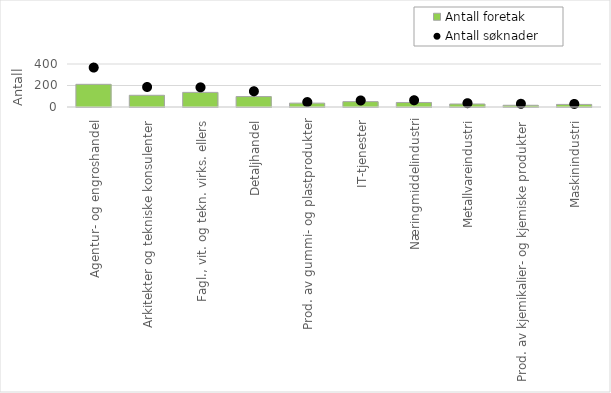
| Category | Antall foretak |
|---|---|
| Agentur- og engroshandel | 211 |
| Arkitekter og tekniske konsulenter | 109 |
| Fagl., vit. og tekn. virks. ellers | 136 |
| Detaljhandel | 97 |
| Prod. av gummi- og plastprodukter | 36 |
| IT-tjenester | 50 |
| Næringmiddelindustri | 42 |
| Metallvareindustri | 28 |
| Prod. av kjemikalier- og kjemiske produkter | 16 |
| Maskinindustri | 24 |